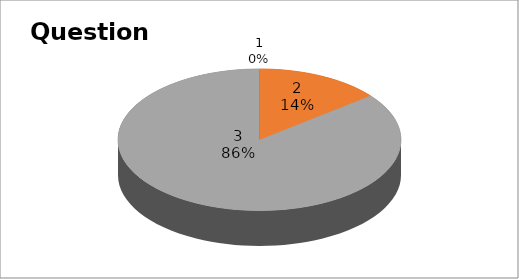
| Category | Series 0 |
|---|---|
| 0 | 0 |
| 1 | 3 |
| 2 | 18 |